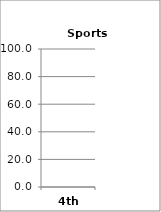
| Category | Sports (Choices) |
|---|---|
| 4th | 0 |